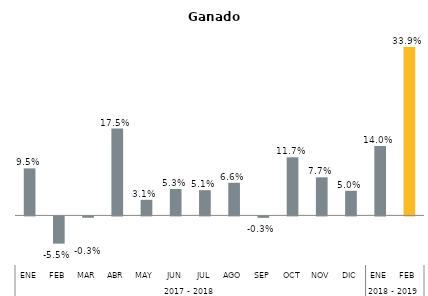
| Category | Jalisco |
|---|---|
| 0 | 0.095 |
| 1 | -0.055 |
| 2 | -0.003 |
| 3 | 0.175 |
| 4 | 0.031 |
| 5 | 0.053 |
| 6 | 0.051 |
| 7 | 0.066 |
| 8 | -0.003 |
| 9 | 0.117 |
| 10 | 0.077 |
| 11 | 0.05 |
| 12 | 0.14 |
| 13 | 0.339 |